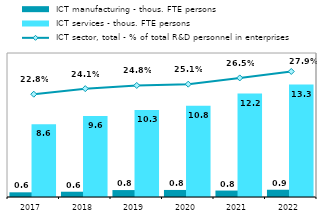
| Category |  ICT manufacturing - thous. FTE persons |  ICT services - thous. FTE persons |
|---|---|---|
| 2017.0 | 0.553 | 8.578 |
| 2018.0 | 0.623 | 9.573 |
| 2019.0 | 0.818 | 10.284 |
| 2020.0 | 0.832 | 10.76 |
| 2021.0 | 0.761 | 12.21 |
| 2022.0 | 0.857 | 13.276 |